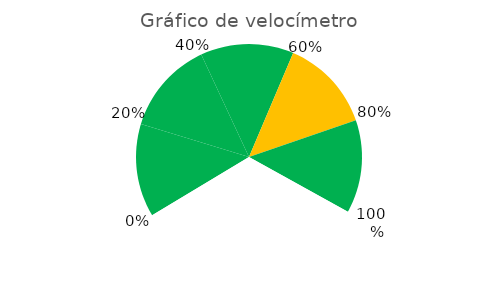
| Category | Series 0 |
|---|---|
| Valor 1 | 0.2 |
| Valor 2 | 0.2 |
| Valor 3 | 0.2 |
| Valor 4 | 0.2 |
| Valor 5 | 0.2 |
| Segmento Blanco | 0.5 |